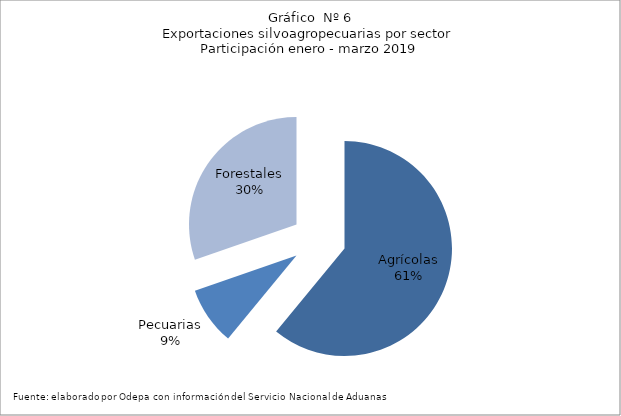
| Category | Series 0 |
|---|---|
| Agrícolas | 10190231 |
| Pecuarias | 1458840 |
| Forestales | 5063823 |